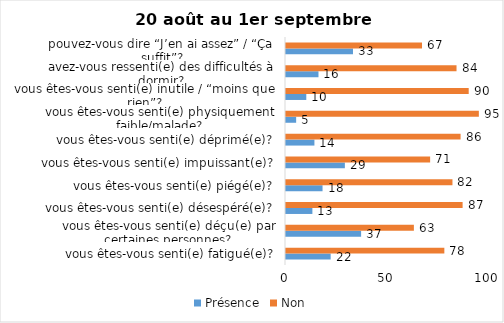
| Category | Présence | Non |
|---|---|---|
| vous êtes-vous senti(e) fatigué(e)? | 22 | 78 |
| vous êtes-vous senti(e) déçu(e) par certaines personnes? | 37 | 63 |
| vous êtes-vous senti(e) désespéré(e)? | 13 | 87 |
| vous êtes-vous senti(e) piégé(e)? | 18 | 82 |
| vous êtes-vous senti(e) impuissant(e)? | 29 | 71 |
| vous êtes-vous senti(e) déprimé(e)? | 14 | 86 |
| vous êtes-vous senti(e) physiquement faible/malade? | 5 | 95 |
| vous êtes-vous senti(e) inutile / “moins que rien”? | 10 | 90 |
| avez-vous ressenti(e) des difficultés à dormir? | 16 | 84 |
| pouvez-vous dire “J’en ai assez” / “Ça suffit”? | 33 | 67 |